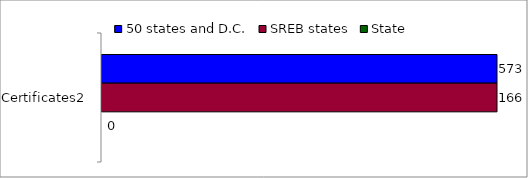
| Category | 50 states and D.C. | SREB states | State |
|---|---|---|---|
| Certificates2 | 573 | 166 | 0 |